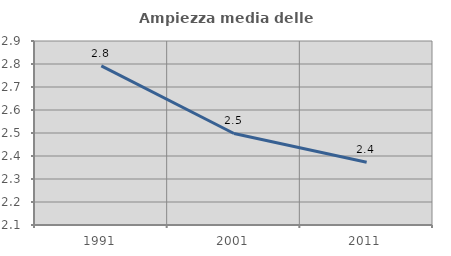
| Category | Ampiezza media delle famiglie |
|---|---|
| 1991.0 | 2.792 |
| 2001.0 | 2.498 |
| 2011.0 | 2.373 |